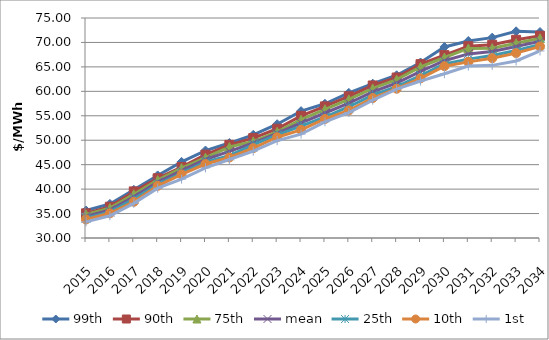
| Category | 99th | 90th | 75th | mean | 25th | 10th | 1st |
|---|---|---|---|---|---|---|---|
| 2015.0 | 35.63 | 35.037 | 34.822 | 34.415 | 34.039 | 33.795 | 33.292 |
| 2016.0 | 36.971 | 36.389 | 36.119 | 35.734 | 35.342 | 35.049 | 34.554 |
| 2017.0 | 39.854 | 39.529 | 38.948 | 38.446 | 37.968 | 37.403 | 37.081 |
| 2018.0 | 42.797 | 42.22 | 41.843 | 41.433 | 40.983 | 40.674 | 40.202 |
| 2019.0 | 45.571 | 44.525 | 44.298 | 43.772 | 43.258 | 43.02 | 42.042 |
| 2020.0 | 47.886 | 47.046 | 46.428 | 46.06 | 45.576 | 45.134 | 44.348 |
| 2021.0 | 49.421 | 49.06 | 48.606 | 47.724 | 46.829 | 46.468 | 46.05 |
| 2022.0 | 51.108 | 50.427 | 49.77 | 49.424 | 49.091 | 48.381 | 47.765 |
| 2023.0 | 53.271 | 52.344 | 51.722 | 51.412 | 51.105 | 50.611 | 49.918 |
| 2024.0 | 55.945 | 54.981 | 54.199 | 53.531 | 52.901 | 52.122 | 51.25 |
| 2025.0 | 57.458 | 56.918 | 56.332 | 55.567 | 54.748 | 54.339 | 53.76 |
| 2026.0 | 59.678 | 58.986 | 58.346 | 57.6 | 56.849 | 56.1 | 55.664 |
| 2027.0 | 61.558 | 61.199 | 60.6 | 59.886 | 59.223 | 58.624 | 58.204 |
| 2028.0 | 63.282 | 62.821 | 62.398 | 61.705 | 60.979 | 60.532 | 60.439 |
| 2029.0 | 65.897 | 65.55 | 65.015 | 64.067 | 63.237 | 62.654 | 62.113 |
| 2030.0 | 69.077 | 67.407 | 66.917 | 66.255 | 65.608 | 65.148 | 63.6 |
| 2031.0 | 70.295 | 69.229 | 68.769 | 67.655 | 66.587 | 66.029 | 65.18 |
| 2032.0 | 70.984 | 69.516 | 68.828 | 68.144 | 67.346 | 66.784 | 65.311 |
| 2033.0 | 72.275 | 70.542 | 69.844 | 69.158 | 68.34 | 67.818 | 66.207 |
| 2034.0 | 72.13 | 71.36 | 70.861 | 70.225 | 69.544 | 69.169 | 68.257 |